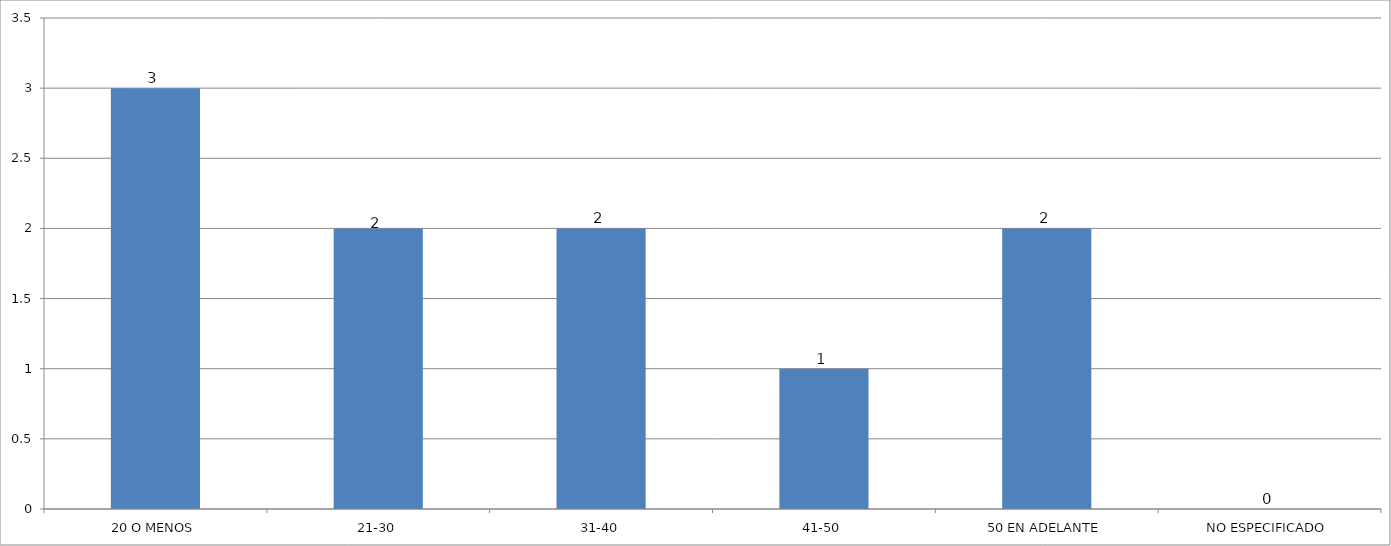
| Category | Series 0 |
|---|---|
| 20 O MENOS | 3 |
| 21-30 | 2 |
| 31-40 | 2 |
| 41-50 | 1 |
| 50 EN ADELANTE | 2 |
| NO ESPECIFICADO | 0 |